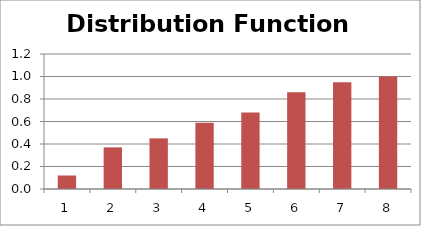
| Category | F(x) |
|---|---|
| 0 | 0.12 |
| 1 | 0.37 |
| 2 | 0.45 |
| 3 | 0.59 |
| 4 | 0.68 |
| 5 | 0.86 |
| 6 | 0.95 |
| 7 | 1 |